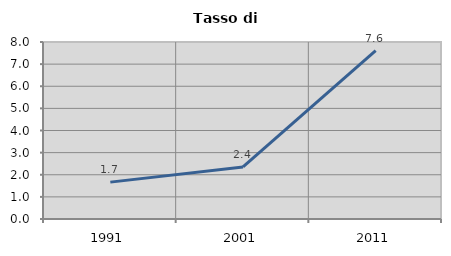
| Category | Tasso di disoccupazione   |
|---|---|
| 1991.0 | 1.667 |
| 2001.0 | 2.353 |
| 2011.0 | 7.606 |